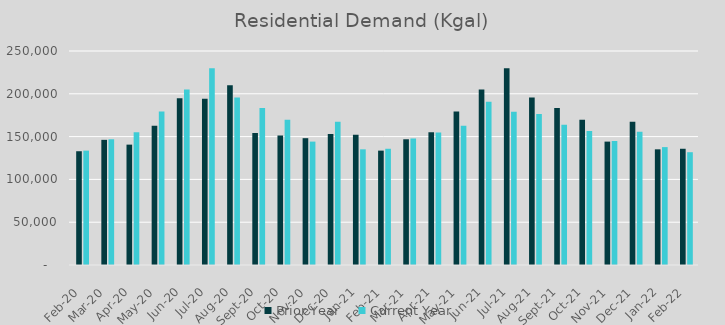
| Category | Prior Year | Current Year |
|---|---|---|
| 2020-02-01 | 132905 | 133616 |
| 2020-03-01 | 146212 | 146882 |
| 2020-04-01 | 140621 | 154955 |
| 2020-05-01 | 162790 | 179419 |
| 2020-06-01 | 194665 | 205078 |
| 2020-07-01 | 194086 | 229973 |
| 2020-08-01 | 209888 | 195761 |
| 2020-09-01 | 154070 | 183286 |
| 2020-10-01 | 151246 | 169712 |
| 2020-11-01 | 148146 | 144154 |
| 2020-12-01 | 152941 | 167244 |
| 2021-01-01 | 152023 | 135131 |
| 2021-02-01 | 133616 | 135791 |
| 2021-03-01 | 146882 | 147789 |
| 2021-04-01 | 154955 | 154879 |
| 2021-05-01 | 179419 | 162769 |
| 2021-06-01 | 205078 | 190687 |
| 2021-07-01 | 229973 | 178886 |
| 2021-08-01 | 195761 | 176317 |
| 2021-09-01 | 183286 | 163837 |
| 2021-10-01 | 169712 | 156648 |
| 2021-11-01 | 144154 | 144871 |
| 2021-12-01 | 167244 | 155618 |
| 2022-01-01 | 135131 | 137724 |
| 2022-02-01 | 135791 | 131769 |